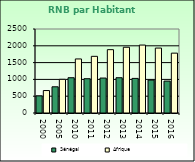
| Category | Sénégal | Afrique                        |
|---|---|---|
| 2000.0 | 510 | 668.557 |
| 2005.0 | 780 | 1002.896 |
| 2010.0 | 1050 | 1608.999 |
| 2011.0 | 1020 | 1686.521 |
| 2012.0 | 1040 | 1885.129 |
| 2013.0 | 1050 | 1956.671 |
| 2014.0 | 1030 | 2022.289 |
| 2015.0 | 980 | 1932.283 |
| 2016.0 | 950 | 1781.415 |